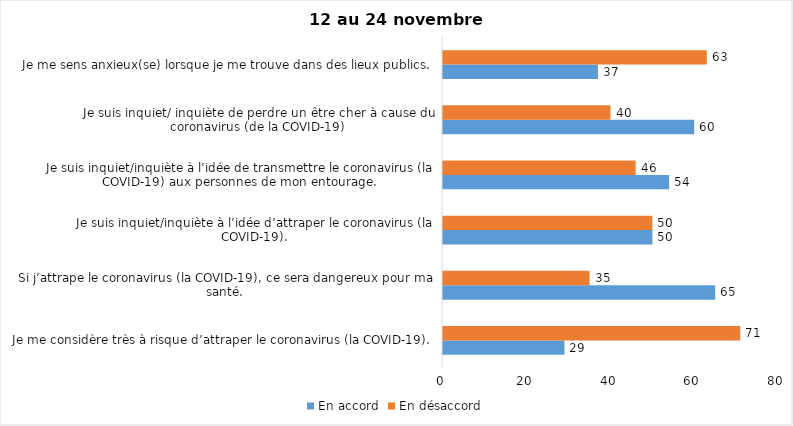
| Category | En accord | En désaccord |
|---|---|---|
| Je me considère très à risque d’attraper le coronavirus (la COVID-19). | 29 | 71 |
| Si j’attrape le coronavirus (la COVID-19), ce sera dangereux pour ma santé. | 65 | 35 |
| Je suis inquiet/inquiète à l’idée d’attraper le coronavirus (la COVID-19). | 50 | 50 |
| Je suis inquiet/inquiète à l’idée de transmettre le coronavirus (la COVID-19) aux personnes de mon entourage. | 54 | 46 |
| Je suis inquiet/ inquiète de perdre un être cher à cause du coronavirus (de la COVID-19) | 60 | 40 |
| Je me sens anxieux(se) lorsque je me trouve dans des lieux publics. | 37 | 63 |